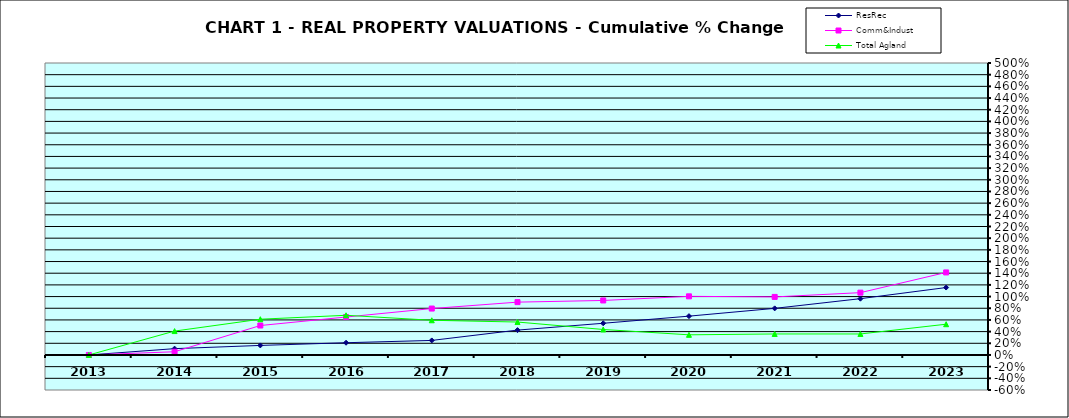
| Category | ResRec | Comm&Indust | Total Agland |
|---|---|---|---|
| 2013.0 | 0 | 0 | 0 |
| 2014.0 | 0.108 | 0.055 | 0.409 |
| 2015.0 | 0.163 | 0.504 | 0.612 |
| 2016.0 | 0.21 | 0.65 | 0.68 |
| 2017.0 | 0.249 | 0.795 | 0.594 |
| 2018.0 | 0.426 | 0.905 | 0.564 |
| 2019.0 | 0.543 | 0.933 | 0.437 |
| 2020.0 | 0.665 | 1.004 | 0.345 |
| 2021.0 | 0.798 | 0.994 | 0.36 |
| 2022.0 | 0.964 | 1.067 | 0.36 |
| 2023.0 | 1.155 | 1.413 | 0.527 |